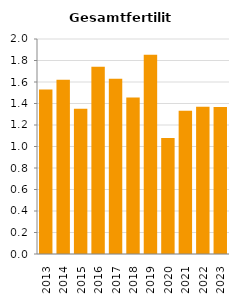
| Category | Gesamtfertilität |
|---|---|
| 2013.0 | 1.53 |
| 2014.0 | 1.621 |
| 2015.0 | 1.352 |
| 2016.0 | 1.741 |
| 2017.0 | 1.631 |
| 2018.0 | 1.456 |
| 2019.0 | 1.853 |
| 2020.0 | 1.08 |
| 2021.0 | 1.332 |
| 2022.0 | 1.37 |
| 2023.0 | 1.367 |